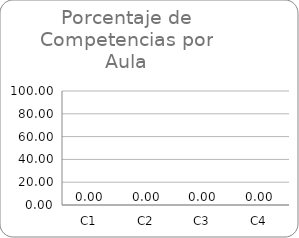
| Category | Series 0 |
|---|---|
| C1 | 0 |
| C2 | 0 |
| C3 | 0 |
| C4 | 0 |